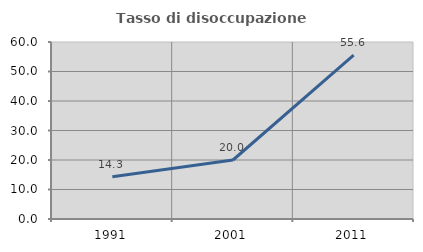
| Category | Tasso di disoccupazione giovanile  |
|---|---|
| 1991.0 | 14.286 |
| 2001.0 | 20 |
| 2011.0 | 55.556 |